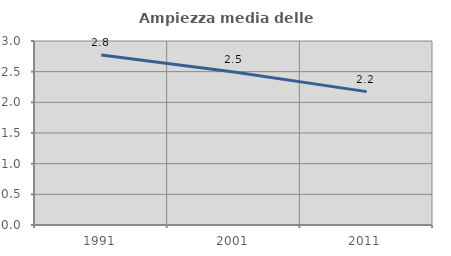
| Category | Ampiezza media delle famiglie |
|---|---|
| 1991.0 | 2.774 |
| 2001.0 | 2.495 |
| 2011.0 | 2.174 |